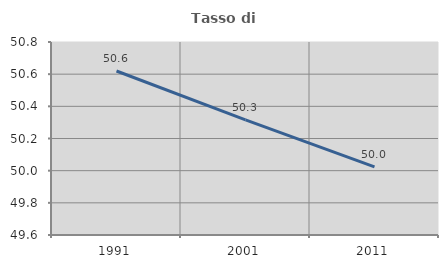
| Category | Tasso di occupazione   |
|---|---|
| 1991.0 | 50.62 |
| 2001.0 | 50.316 |
| 2011.0 | 50.023 |